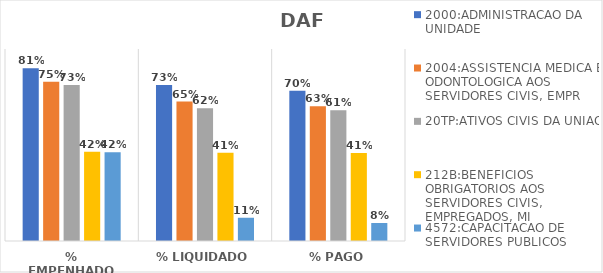
| Category | 2000:ADMINISTRACAO DA UNIDADE | 2004:ASSISTENCIA MEDICA E ODONTOLOGICA AOS SERVIDORES CIVIS, EMPR | 20TP:ATIVOS CIVIS DA UNIAO | 212B:BENEFICIOS OBRIGATORIOS AOS SERVIDORES CIVIS, EMPREGADOS, MI | 4572:CAPACITACAO DE SERVIDORES PUBLICOS FEDERAIS EM PROCESSO DE Q |
|---|---|---|---|---|---|
| % EMPENHADO | 0.81 | 0.746 | 0.731 | 0.418 | 0.417 |
| % LIQUIDADO | 0.731 | 0.653 | 0.622 | 0.413 | 0.109 |
| % PAGO | 0.704 | 0.632 | 0.613 | 0.413 | 0.084 |